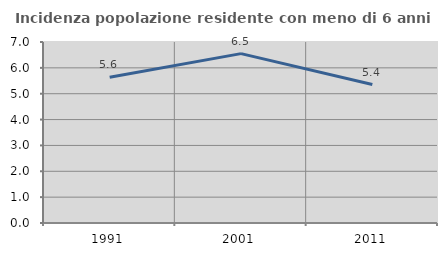
| Category | Incidenza popolazione residente con meno di 6 anni |
|---|---|
| 1991.0 | 5.635 |
| 2001.0 | 6.55 |
| 2011.0 | 5.353 |